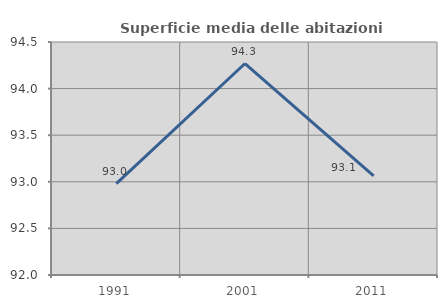
| Category | Superficie media delle abitazioni occupate |
|---|---|
| 1991.0 | 92.981 |
| 2001.0 | 94.269 |
| 2011.0 | 93.062 |